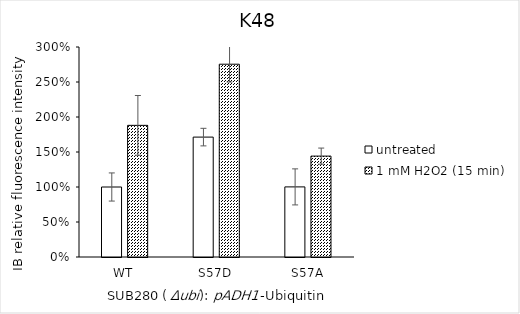
| Category | untreated | 1 mM H2O2 (15 min) |
|---|---|---|
| WT | 1 | 1.881 |
| S57D | 1.713 | 2.754 |
| S57A | 1.002 | 1.441 |